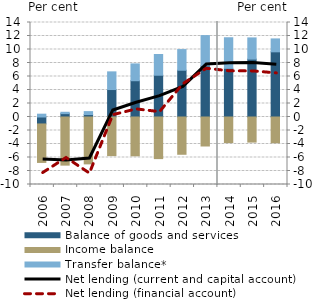
| Category | Balance of goods and services | Income balance | Transfer balance* |
|---|---|---|---|
| 2006.0 | -1.031 | -5.7 | 0.418 |
| 2007.0 | 0.498 | -7.131 | 0.202 |
| 2008.0 | 0.36 | -6.946 | 0.439 |
| 2009.0 | 4.069 | -5.722 | 2.617 |
| 2010.0 | 5.375 | -5.752 | 2.492 |
| 2011.0 | 6.189 | -6.165 | 3.071 |
| 2012.0 | 6.928 | -5.522 | 3.059 |
| 2013.0 | 7.586 | -4.296 | 4.474 |
| 2014.0 | 7.215 | -3.792 | 4.526 |
| 2015.0 | 8.576 | -3.717 | 3.142 |
| 2016.0 | 9.655 | -3.818 | 1.914 |